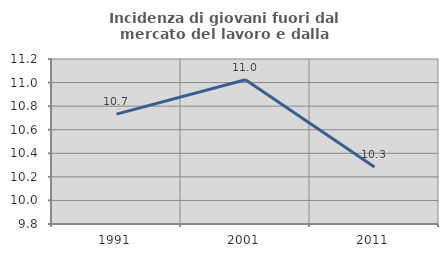
| Category | Incidenza di giovani fuori dal mercato del lavoro e dalla formazione  |
|---|---|
| 1991.0 | 10.732 |
| 2001.0 | 11.024 |
| 2011.0 | 10.284 |